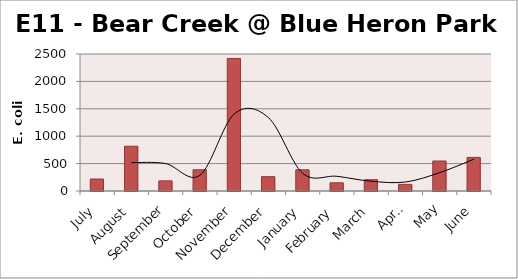
| Category | E. coli MPN |
|---|---|
| July | 218.7 |
| August | 816.4 |
| September | 185 |
| October | 387.3 |
| November | 2419.2 |
| December | 261.3 |
| January | 387.3 |
| February | 149.7 |
| March | 206.3 |
| April | 121.1 |
| May | 547.5 |
| June | 613.1 |